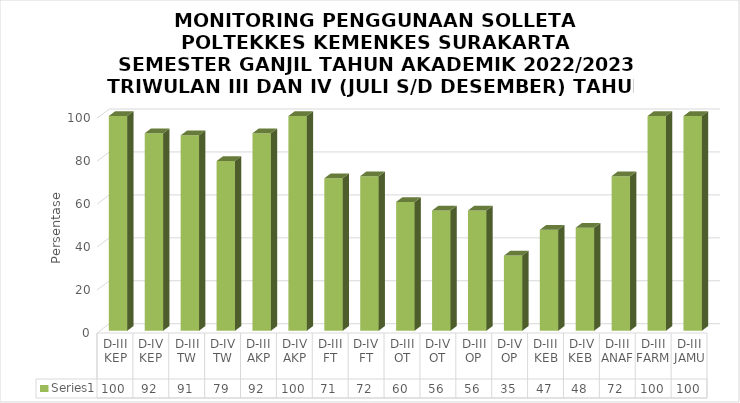
| Category | Series 0 |
|---|---|
| D-III KEP | 100 |
| D-IV KEP | 92 |
| D-III TW | 91 |
| D-IV TW | 79 |
| D-III AKP | 92 |
| D-IV AKP | 100 |
| D-III FT | 71 |
| D-IV FT | 72 |
| D-III OT | 60 |
| D-IV OT | 56 |
| D-III OP | 56 |
| D-IV OP | 35 |
| D-III KEB | 47 |
| D-IV KEB  | 48 |
| D-III ANAF | 72 |
| D-III FARM | 100 |
| D-III JAMU | 100 |